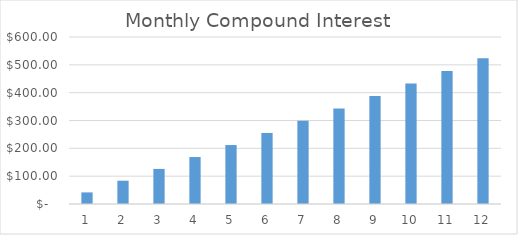
| Category | Interest |
|---|---|
| 1.0 | 41.667 |
| 2.0 | 83.681 |
| 3.0 | 126.045 |
| 4.0 | 168.762 |
| 5.0 | 211.835 |
| 6.0 | 255.267 |
| 7.0 | 299.06 |
| 8.0 | 343.219 |
| 9.0 | 387.746 |
| 10.0 | 432.644 |
| 11.0 | 477.916 |
| 12.0 | 523.565 |